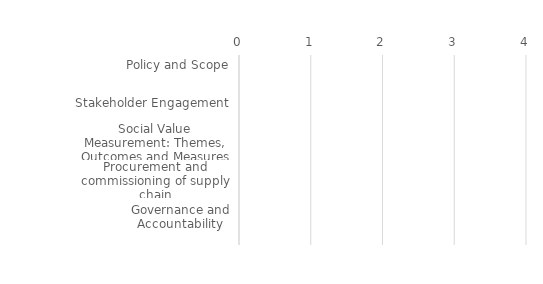
| Category | Future | Present |
|---|---|---|
| Policy and Scope | 0 | 0 |
| Culture and Management | 0 | 0 |
| Stakeholder Engagement | 0 | 0 |
| Community Projects Design | 0 | 0 |
| Social Value Measurement: Themes, Outcomes and Measures | 0 | 0 |
| Bid Management and Contract Reporting | 0 | 0 |
| Procurement and commissioning of supply chain | 0 | 0 |
| Reporting | 0 | 0 |
| Governance and Accountability | 0 | 0 |
| Overall | 0 | 0 |